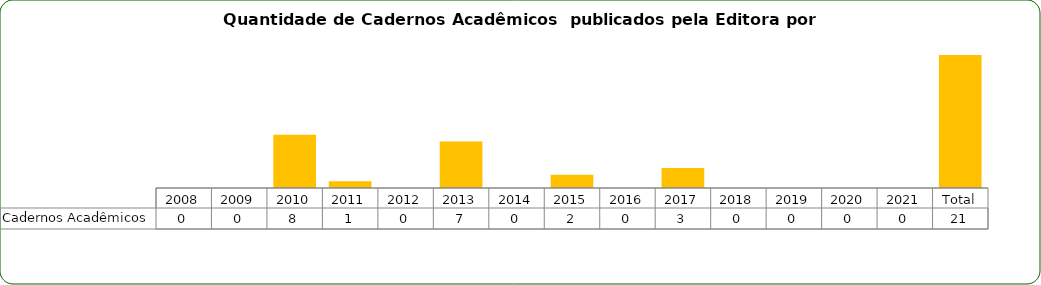
| Category | Cadernos Acadêmicos  |
|---|---|
| 2008 | 0 |
| 2009 | 0 |
| 2010 | 8 |
| 2011 | 1 |
| 2012 | 0 |
| 2013 | 7 |
| 2014 | 0 |
| 2015 | 2 |
| 2016 | 0 |
| 2017 | 3 |
| 2018 | 0 |
| 2019 | 0 |
| 2020 | 0 |
| 2021 | 0 |
| Total | 21 |